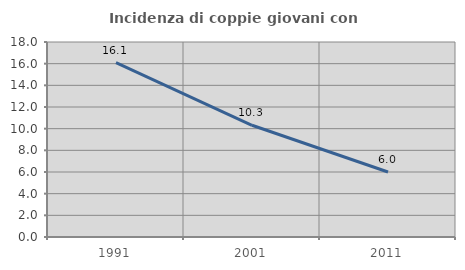
| Category | Incidenza di coppie giovani con figli |
|---|---|
| 1991.0 | 16.099 |
| 2001.0 | 10.311 |
| 2011.0 | 6.002 |